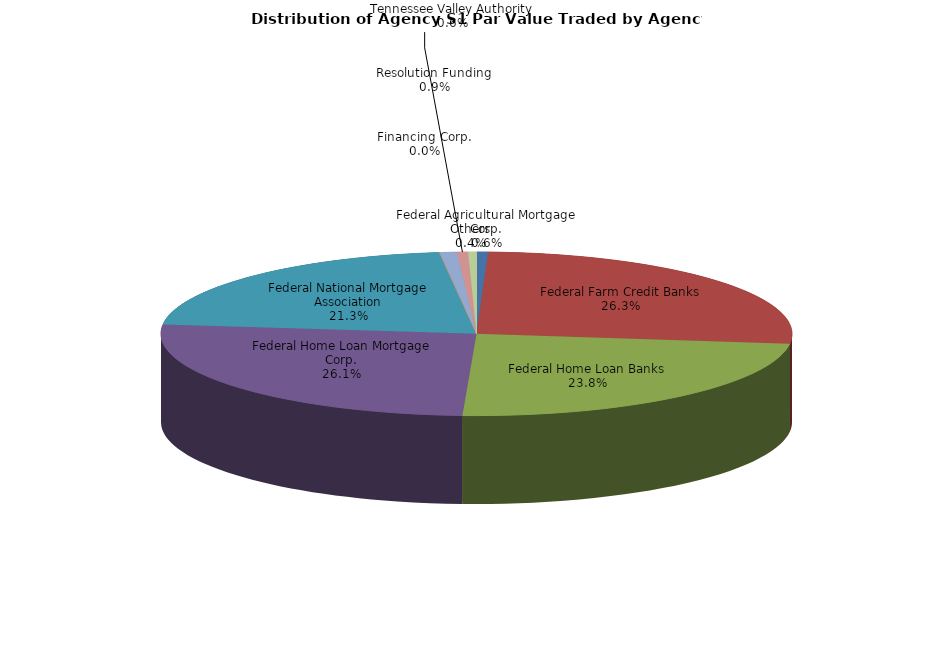
| Category | Series 0 |
|---|---|
| Federal Agricultural Mortgage Corp. | 31345347.826 |
| Federal Farm Credit Banks | 1406729377.47 |
| Federal Home Loan Banks | 1270116680.18 |
| Federal Home Loan Mortgage Corp. | 1394065691.297 |
| Federal National Mortgage Association | 1137945239.463 |
| Financing Corp. | 0 |
| Resolution Funding | 46944316.205 |
| Tennessee Valley Authority | 30219856.504 |
| Others | 22806648.788 |